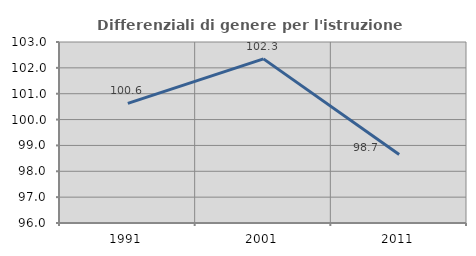
| Category | Differenziali di genere per l'istruzione superiore |
|---|---|
| 1991.0 | 100.628 |
| 2001.0 | 102.348 |
| 2011.0 | 98.652 |